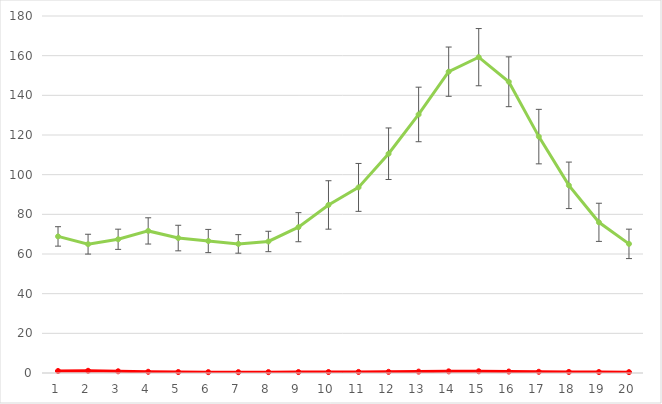
| Category | SMC3 | FISH |
|---|---|---|
| 0 | 1 | 68.865 |
| 1 | 1.111 | 64.957 |
| 2 | 0.868 | 67.423 |
| 3 | 0.616 | 71.639 |
| 4 | 0.479 | 68.038 |
| 5 | 0.431 | 66.549 |
| 6 | 0.415 | 65.093 |
| 7 | 0.438 | 66.314 |
| 8 | 0.471 | 73.514 |
| 9 | 0.49 | 84.734 |
| 10 | 0.54 | 93.575 |
| 11 | 0.586 | 110.557 |
| 12 | 0.702 | 130.361 |
| 13 | 0.828 | 151.928 |
| 14 | 0.868 | 159.247 |
| 15 | 0.739 | 146.841 |
| 16 | 0.609 | 119.193 |
| 17 | 0.536 | 94.622 |
| 18 | 0.486 | 75.973 |
| 19 | 0.439 | 65.102 |